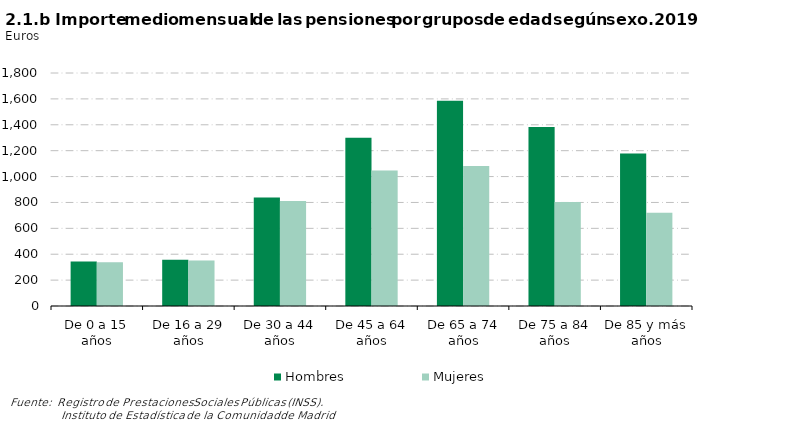
| Category | Hombres | Mujeres |
|---|---|---|
| De 0 a 15 años | 343.109 | 337.706 |
| De 16 a 29 años | 356.696 | 352.372 |
| De 30 a 44 años | 837.606 | 810.65 |
| De 45 a 64 años | 1299.609 | 1046.068 |
| De 65 a 74 años | 1585.333 | 1081.098 |
| De 75 a 84 años | 1383.659 | 803.104 |
| De 85 y más años | 1178.875 | 720.094 |